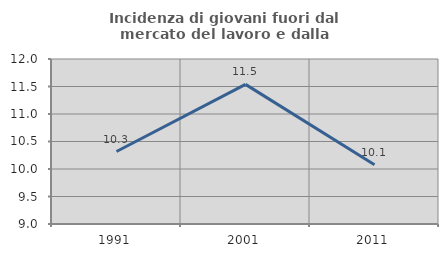
| Category | Incidenza di giovani fuori dal mercato del lavoro e dalla formazione  |
|---|---|
| 1991.0 | 10.317 |
| 2001.0 | 11.538 |
| 2011.0 | 10.078 |